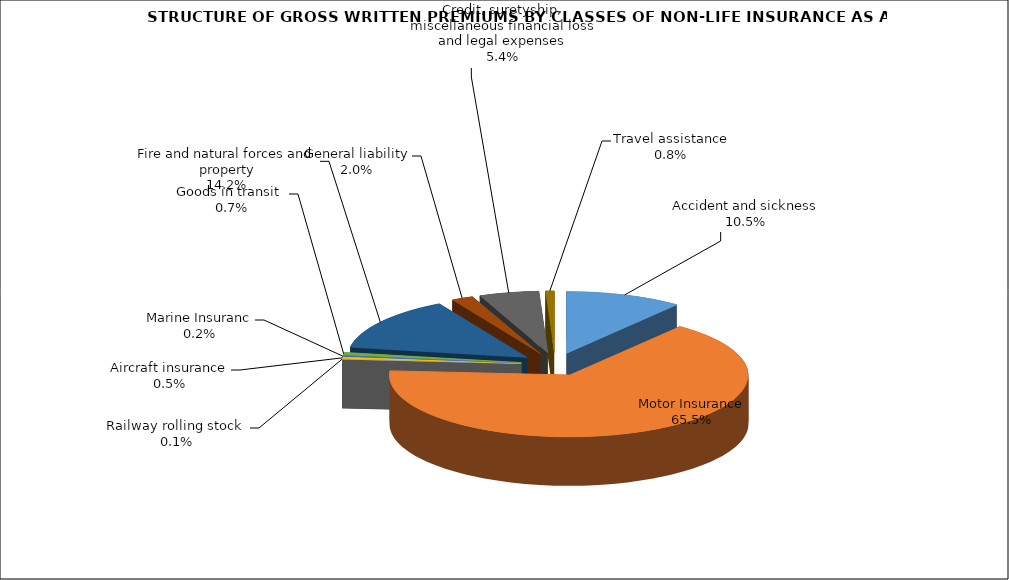
| Category | Accident and sickness | Series 1 |
|---|---|---|
| Accident and sickness | 0.105 | 0.12 |
| Motor Insurance | 0.655 | 0.652 |
| Railway rolling stock  | 0.001 | 0.001 |
| Aircraft insurance | 0.005 | 0.003 |
| Marine Insuranc | 0.002 | 0.002 |
| Goods in transit  | 0.007 | 0.007 |
| Fire and natural forces and property | 0.142 | 0.147 |
| General liability | 0.02 | 0.021 |
| Credit, suretyship, miscellaneous financial loss and legal expenses | 0.054 | 0.038 |
| Travel assistance | 0.008 | 0.008 |